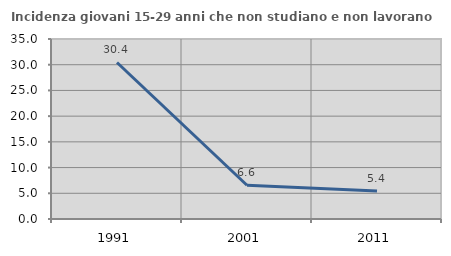
| Category | Incidenza giovani 15-29 anni che non studiano e non lavorano  |
|---|---|
| 1991.0 | 30.435 |
| 2001.0 | 6.557 |
| 2011.0 | 5.442 |